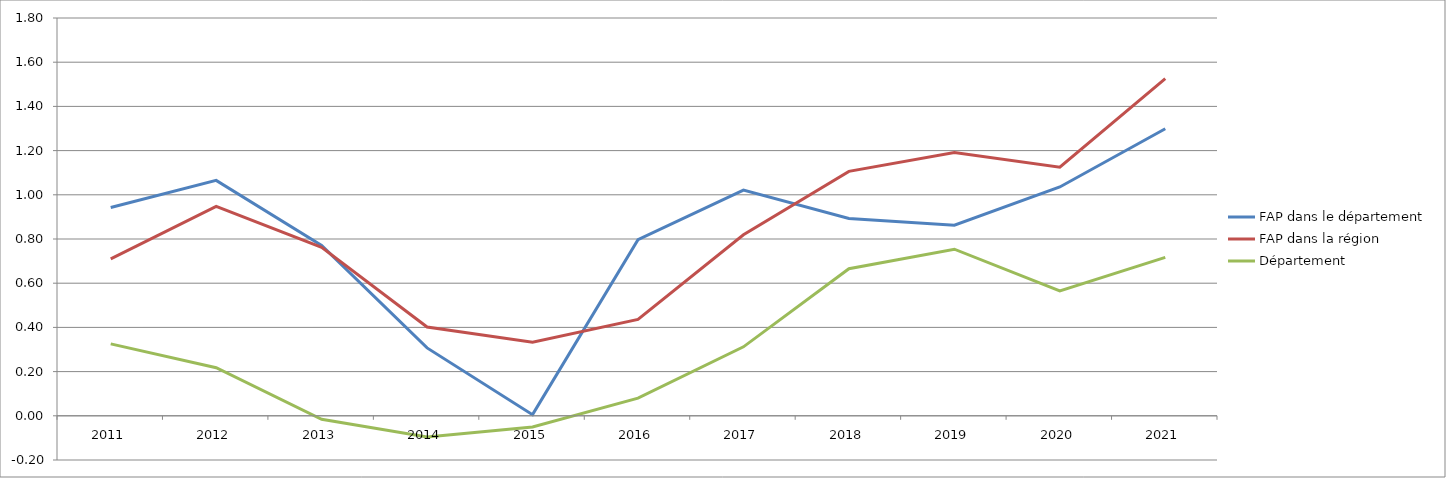
| Category | FAP dans le département | FAP dans la région | Département |
|---|---|---|---|
| 2011.0 | 0.942 | 0.71 | 0.326 |
| 2012.0 | 1.065 | 0.947 | 0.218 |
| 2013.0 | 0.771 | 0.762 | -0.016 |
| 2014.0 | 0.307 | 0.402 | -0.096 |
| 2015.0 | 0.005 | 0.333 | -0.051 |
| 2016.0 | 0.797 | 0.436 | 0.08 |
| 2017.0 | 1.021 | 0.819 | 0.312 |
| 2018.0 | 0.893 | 1.106 | 0.666 |
| 2019.0 | 0.862 | 1.192 | 0.754 |
| 2020.0 | 1.035 | 1.125 | 0.565 |
| 2021.0 | 1.299 | 1.525 | 0.717 |